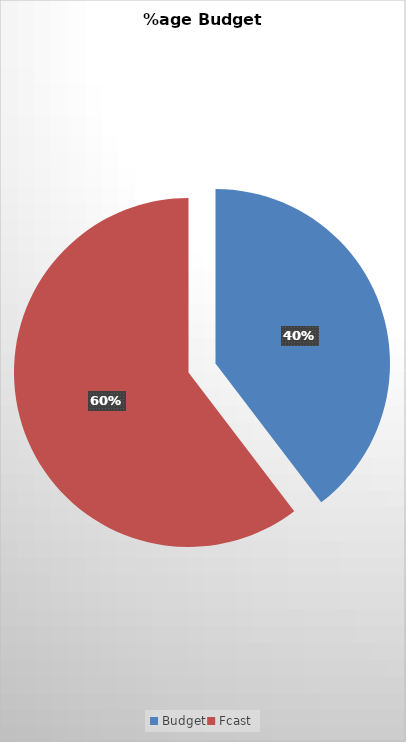
| Category | Series 0 |
|---|---|
| Budget | 1189.21 |
| Fcast | 1810.79 |